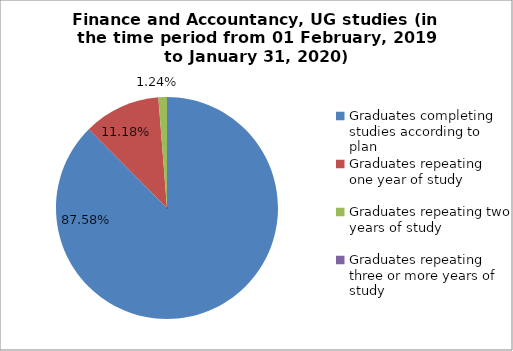
| Category | Series 0 |
|---|---|
| Graduates completing studies according to plan | 87.578 |
| Graduates repeating one year of study | 11.18 |
| Graduates repeating two years of study | 1.242 |
| Graduates repeating three or more years of study | 0 |